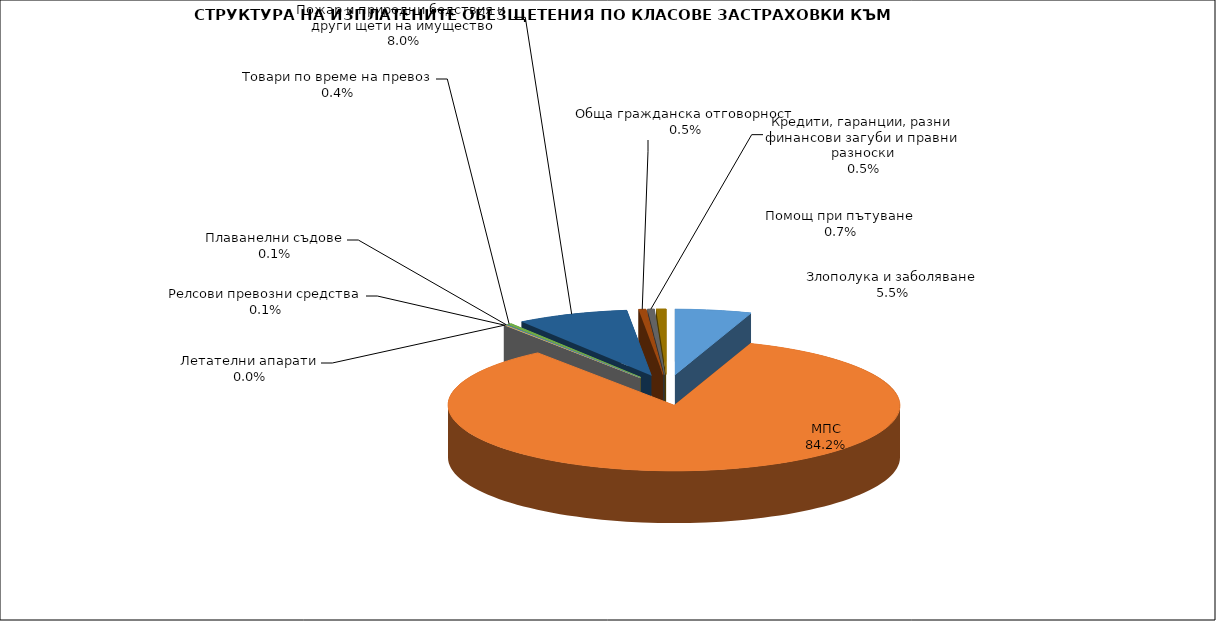
| Category | Series 0 |
|---|---|
| Злополука и заболяване | 0.055 |
| МПС | 0.842 |
| Релсови превозни средства | 0.001 |
| Летателни апарати | 0 |
| Плаванелни съдове | 0.001 |
| Товари по време на превоз | 0.004 |
| Пожар и природни бедствия и други щети на имущество | 0.08 |
| Обща гражданска отговорност | 0.005 |
| Кредити, гаранции, разни финансови загуби и правни разноски | 0.005 |
| Помощ при пътуване | 0.007 |